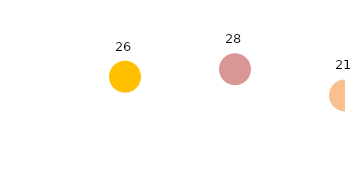
| Category | Series 0 |
|---|---|
| 0 | 26 |
| 1 | 28 |
| 2 | 21 |
| 3 | 19 |